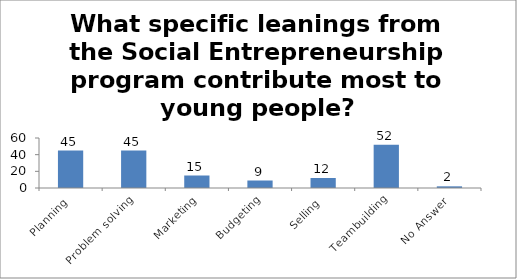
| Category | What specific leanings from the Social Entrepreneurship program contribute most to young people? |
|---|---|
| Planning | 45 |
| Problem solving | 45 |
| Marketing | 15 |
| Budgeting | 9 |
| Selling | 12 |
| Teambuilding | 52 |
| No Answer | 2 |